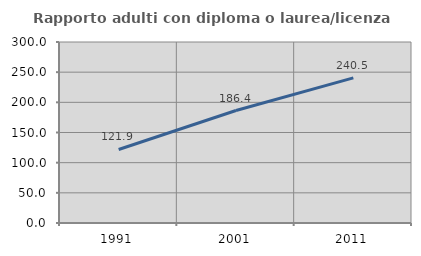
| Category | Rapporto adulti con diploma o laurea/licenza media  |
|---|---|
| 1991.0 | 121.867 |
| 2001.0 | 186.386 |
| 2011.0 | 240.491 |